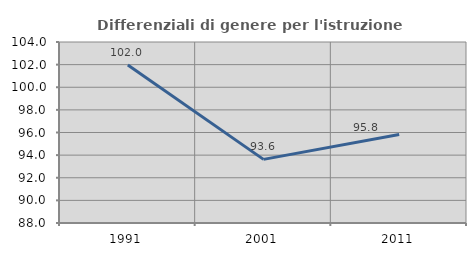
| Category | Differenziali di genere per l'istruzione superiore |
|---|---|
| 1991.0 | 101.965 |
| 2001.0 | 93.624 |
| 2011.0 | 95.816 |